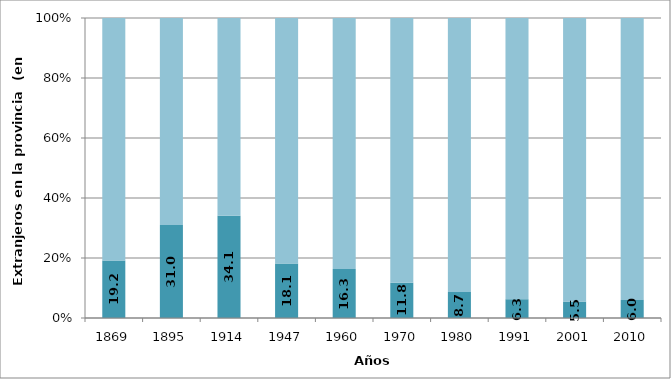
| Category | Extranjeros | Nativos |
|---|---|---|
| 1869.0 | 19.182 | 80.818 |
| 1895.0 | 30.965 | 69.035 |
| 1914.0 | 34.064 | 65.936 |
| 1947.0 | 18.15 | 81.85 |
| 1960.0 | 16.326 | 83.674 |
| 1970.0 | 11.75 | 88.25 |
| 1980.0 | 8.668 | 91.332 |
| 1991.0 | 6.266 | 93.734 |
| 2001.0 | 5.487 | 94.513 |
| 2010.0 | 6.028 | 93.972 |